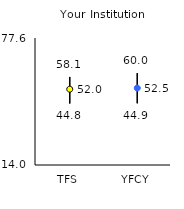
| Category | 25th | 75th | Mean |
|---|---|---|---|
| TFS | 44.8 | 58.1 | 51.96 |
| YFCY | 44.9 | 60 | 52.54 |